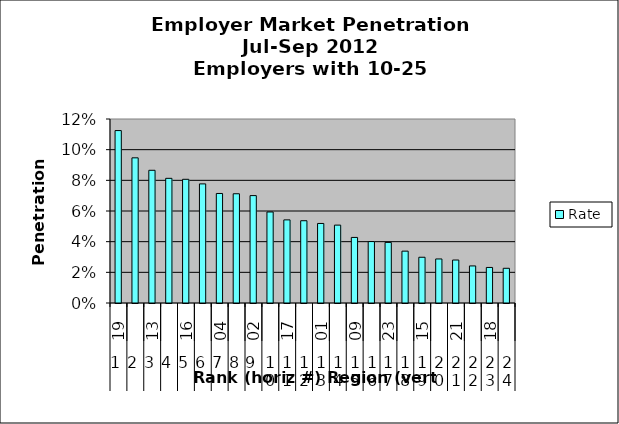
| Category | Rate |
|---|---|
| 0 | 0.112 |
| 1 | 0.095 |
| 2 | 0.087 |
| 3 | 0.081 |
| 4 | 0.081 |
| 5 | 0.078 |
| 6 | 0.071 |
| 7 | 0.071 |
| 8 | 0.07 |
| 9 | 0.059 |
| 10 | 0.054 |
| 11 | 0.054 |
| 12 | 0.052 |
| 13 | 0.051 |
| 14 | 0.043 |
| 15 | 0.04 |
| 16 | 0.04 |
| 17 | 0.034 |
| 18 | 0.03 |
| 19 | 0.029 |
| 20 | 0.028 |
| 21 | 0.024 |
| 22 | 0.023 |
| 23 | 0.023 |